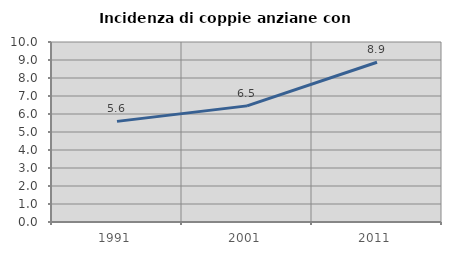
| Category | Incidenza di coppie anziane con figli |
|---|---|
| 1991.0 | 5.59 |
| 2001.0 | 6.452 |
| 2011.0 | 8.876 |